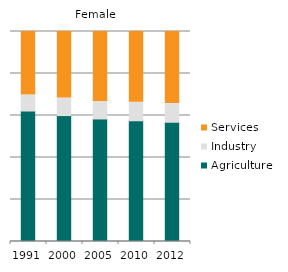
| Category | Agriculture | Industry | Services |
|---|---|---|---|
| 1991.0 | 62.13 | 7.691 | 30.179 |
| 2000.0 | 59.961 | 8.36 | 31.679 |
| 2005.0 | 58.355 | 8.303 | 33.342 |
| 2010.0 | 57.499 | 8.831 | 33.669 |
| 2012.0 | 56.785 | 8.887 | 34.328 |